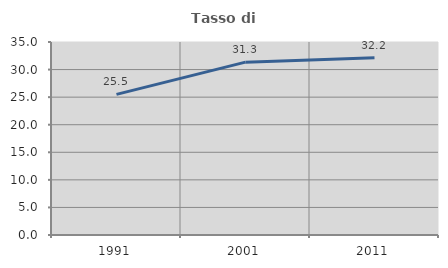
| Category | Tasso di occupazione   |
|---|---|
| 1991.0 | 25.498 |
| 2001.0 | 31.349 |
| 2011.0 | 32.151 |